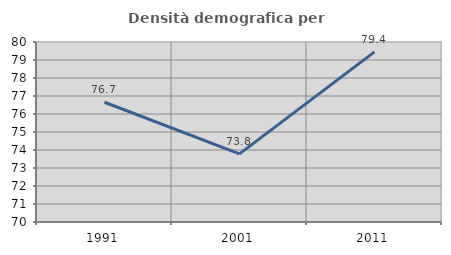
| Category | Densità demografica |
|---|---|
| 1991.0 | 76.653 |
| 2001.0 | 73.785 |
| 2011.0 | 79.45 |